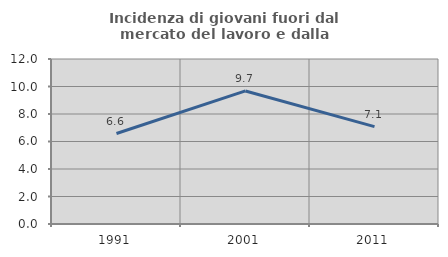
| Category | Incidenza di giovani fuori dal mercato del lavoro e dalla formazione  |
|---|---|
| 1991.0 | 6.579 |
| 2001.0 | 9.677 |
| 2011.0 | 7.082 |